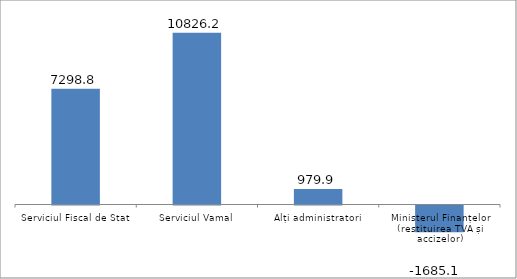
| Category | Series 0 |
|---|---|
| Serviciul Fiscal de Stat | 7298.8 |
| Serviciul Vamal | 10826.2 |
| Alți administratori | 979.9 |
| Ministerul Finanțelor (restituirea TVA și accizelor) | -1685.1 |